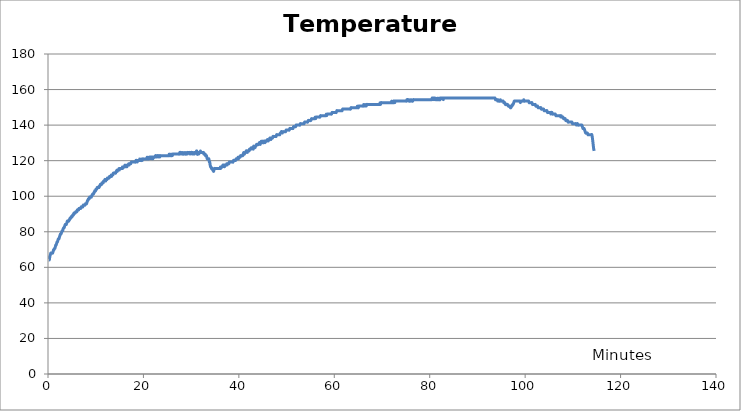
| Category | Temperature (Fahrenheit) |
|---|---|
| 0.18333333333333332 | 64.3 |
| 0.2833333333333333 | 64.3 |
| 0.38333333333333336 | 66.1 |
| 0.48333333333333334 | 67 |
| 0.5833333333333334 | 68 |
| 0.7 | 68 |
| 0.7833333333333333 | 68 |
| 0.8833333333333333 | 68 |
| 0.9666666666666667 | 68 |
| 1.0666666666666667 | 68.8 |
| 1.15 | 69.8 |
| 1.2333333333333334 | 69.8 |
| 1.3333333333333333 | 70.6 |
| 1.4333333333333333 | 70.6 |
| 1.5333333333333334 | 71.5 |
| 1.6166666666666667 | 72.5 |
| 1.7 | 72.5 |
| 1.8 | 73.3 |
| 1.9 | 74.3 |
| 1.9833333333333334 | 74.3 |
| 2.066666666666667 | 75.1 |
| 2.1666666666666665 | 76 |
| 2.283333333333333 | 76 |
| 2.4 | 77 |
| 2.5 | 77.8 |
| 2.6166666666666667 | 78.8 |
| 2.7333333333333334 | 78.8 |
| 2.8333333333333335 | 79.6 |
| 2.95 | 80.5 |
| 3.066666666666667 | 80.5 |
| 3.1666666666666665 | 81.5 |
| 3.283333333333333 | 82.3 |
| 3.4 | 82.3 |
| 3.5 | 83.3 |
| 3.6166666666666667 | 84.1 |
| 3.7333333333333334 | 84.1 |
| 3.8333333333333335 | 84.1 |
| 3.95 | 85 |
| 4.05 | 86 |
| 4.166666666666667 | 86 |
| 4.25 | 86 |
| 4.35 | 86 |
| 4.433333333333334 | 86.8 |
| 4.533333333333333 | 86.8 |
| 4.65 | 87.8 |
| 4.733333333333333 | 87.8 |
| 4.833333333333333 | 87.8 |
| 4.916666666666667 | 88.6 |
| 5.0 | 88.6 |
| 5.083333333333333 | 88.6 |
| 5.183333333333334 | 89.5 |
| 5.266666666666667 | 89.5 |
| 5.35 | 89.5 |
| 5.433333333333334 | 90.5 |
| 5.533333333333333 | 90.5 |
| 5.616666666666666 | 90.5 |
| 5.7 | 90.5 |
| 5.8 | 91.3 |
| 5.883333333333334 | 91.3 |
| 5.966666666666667 | 91.3 |
| 6.05 | 91.3 |
| 6.15 | 92.3 |
| 6.233333333333333 | 92.3 |
| 6.333333333333333 | 92.3 |
| 6.416666666666667 | 92.3 |
| 6.5 | 93.1 |
| 6.6 | 93.1 |
| 6.683333333333334 | 93.1 |
| 6.766666666666667 | 93.1 |
| 6.85 | 93.1 |
| 6.95 | 94 |
| 7.033333333333333 | 94 |
| 7.116666666666666 | 94 |
| 7.216666666666667 | 94 |
| 7.3 | 94 |
| 7.383333333333334 | 95 |
| 7.483333333333333 | 95 |
| 7.566666666666666 | 95 |
| 7.666666666666667 | 95 |
| 7.75 | 95 |
| 7.866666666666666 | 95.8 |
| 7.983333333333333 | 95.8 |
| 8.083333333333334 | 95.8 |
| 8.183333333333334 | 96.7 |
| 8.283333333333333 | 97.6 |
| 8.366666666666667 | 97.6 |
| 8.466666666666667 | 98.5 |
| 8.55 | 98.5 |
| 8.633333333333333 | 98.5 |
| 8.716666666666667 | 99.5 |
| 8.816666666666666 | 99.5 |
| 8.9 | 99.5 |
| 9.0 | 99.5 |
| 9.083333333333334 | 99.5 |
| 9.166666666666666 | 100.4 |
| 9.25 | 100.4 |
| 9.35 | 101.2 |
| 9.433333333333334 | 101.2 |
| 9.516666666666667 | 101.2 |
| 9.616666666666667 | 102.1 |
| 9.7 | 102.1 |
| 9.783333333333333 | 103 |
| 9.883333333333333 | 103 |
| 9.966666666666667 | 103 |
| 10.066666666666666 | 104 |
| 10.15 | 104 |
| 10.233333333333333 | 104 |
| 10.316666666666666 | 104.9 |
| 10.416666666666666 | 104.9 |
| 10.5 | 104.9 |
| 10.6 | 104.9 |
| 10.683333333333334 | 104.9 |
| 10.766666666666667 | 105.7 |
| 10.866666666666667 | 105.7 |
| 10.95 | 106.6 |
| 11.033333333333333 | 106.6 |
| 11.116666666666667 | 106.6 |
| 11.216666666666667 | 106.6 |
| 11.3 | 107.5 |
| 11.383333333333333 | 107.5 |
| 11.483333333333333 | 107.5 |
| 11.566666666666666 | 107.5 |
| 11.65 | 108.5 |
| 11.75 | 108.5 |
| 11.833333333333334 | 108.5 |
| 11.916666666666666 | 109.4 |
| 12.016666666666667 | 109.4 |
| 12.1 | 108.5 |
| 12.2 | 109.4 |
| 12.283333333333333 | 109.4 |
| 12.366666666666667 | 109.4 |
| 12.45 | 110.2 |
| 12.55 | 110.2 |
| 12.633333333333333 | 110.2 |
| 12.716666666666667 | 110.2 |
| 12.8 | 110.2 |
| 12.9 | 111.1 |
| 12.983333333333333 | 111.1 |
| 13.066666666666666 | 111.1 |
| 13.166666666666666 | 111.1 |
| 13.25 | 112 |
| 13.333333333333334 | 111.1 |
| 13.433333333333334 | 112 |
| 13.516666666666667 | 112 |
| 13.6 | 112 |
| 13.7 | 113 |
| 13.783333333333333 | 113 |
| 13.883333333333333 | 113 |
| 13.966666666666667 | 113 |
| 14.066666666666666 | 113 |
| 14.166666666666666 | 113 |
| 14.266666666666667 | 113.9 |
| 14.35 | 113.9 |
| 14.433333333333334 | 114.7 |
| 14.516666666666667 | 113.9 |
| 14.616666666666667 | 114.7 |
| 14.7 | 114.7 |
| 14.783333333333333 | 114.7 |
| 14.866666666666667 | 115.6 |
| 14.966666666666667 | 114.7 |
| 15.05 | 115.6 |
| 15.133333333333333 | 115.6 |
| 15.233333333333333 | 115.6 |
| 15.316666666666666 | 115.6 |
| 15.4 | 115.6 |
| 15.5 | 115.6 |
| 15.583333333333334 | 116.5 |
| 15.666666666666666 | 115.6 |
| 15.766666666666667 | 116.5 |
| 15.85 | 116.5 |
| 15.933333333333334 | 116.5 |
| 16.033333333333335 | 116.5 |
| 16.116666666666667 | 117.5 |
| 16.2 | 116.5 |
| 16.3 | 117.5 |
| 16.383333333333333 | 116.5 |
| 16.466666666666665 | 117.5 |
| 16.55 | 116.5 |
| 16.65 | 117.5 |
| 16.733333333333334 | 117.5 |
| 16.816666666666666 | 117.5 |
| 16.9 | 118.3 |
| 17.0 | 117.5 |
| 17.083333333333332 | 118.3 |
| 17.166666666666668 | 118.3 |
| 17.266666666666666 | 118.3 |
| 17.35 | 118.3 |
| 17.45 | 119.2 |
| 17.533333333333335 | 119.2 |
| 17.616666666666667 | 119.2 |
| 17.7 | 119.2 |
| 17.8 | 119.2 |
| 17.883333333333333 | 119.2 |
| 17.966666666666665 | 119.2 |
| 18.066666666666666 | 119.2 |
| 18.15 | 119.2 |
| 18.233333333333334 | 119.2 |
| 18.333333333333332 | 119.2 |
| 18.416666666666668 | 120.1 |
| 18.516666666666666 | 120.1 |
| 18.633333333333333 | 120.1 |
| 18.716666666666665 | 119.2 |
| 18.816666666666666 | 120.1 |
| 18.9 | 120.1 |
| 18.983333333333334 | 120.1 |
| 19.1 | 120.1 |
| 19.216666666666665 | 121 |
| 19.316666666666666 | 120.1 |
| 19.433333333333334 | 120.1 |
| 19.55 | 120.1 |
| 19.65 | 121 |
| 19.766666666666666 | 120.1 |
| 19.883333333333333 | 121 |
| 19.983333333333334 | 121 |
| 20.1 | 121 |
| 20.2 | 121 |
| 20.316666666666666 | 121 |
| 20.433333333333334 | 121 |
| 20.533333333333335 | 121 |
| 20.65 | 121 |
| 20.766666666666666 | 122 |
| 20.866666666666667 | 121 |
| 20.983333333333334 | 121 |
| 21.083333333333332 | 121 |
| 21.2 | 122 |
| 21.316666666666666 | 121 |
| 21.416666666666668 | 122 |
| 21.533333333333335 | 122 |
| 21.65 | 121 |
| 21.75 | 122 |
| 21.866666666666667 | 122 |
| 21.983333333333334 | 121 |
| 22.083333333333332 | 122 |
| 22.2 | 122 |
| 22.316666666666666 | 122 |
| 22.416666666666668 | 122 |
| 22.533333333333335 | 122.8 |
| 22.65 | 122.8 |
| 22.75 | 122 |
| 22.866666666666667 | 122.8 |
| 22.983333333333334 | 122.8 |
| 23.083333333333332 | 122 |
| 23.2 | 122.8 |
| 23.316666666666666 | 122.8 |
| 23.416666666666668 | 122 |
| 23.533333333333335 | 122.8 |
| 23.65 | 122.8 |
| 23.75 | 122.8 |
| 23.866666666666667 | 122.8 |
| 23.983333333333334 | 122.8 |
| 24.083333333333332 | 122.8 |
| 24.183333333333334 | 122.8 |
| 24.3 | 122.8 |
| 24.416666666666668 | 122.8 |
| 24.516666666666666 | 122.8 |
| 24.633333333333333 | 122.8 |
| 24.733333333333334 | 122.8 |
| 24.85 | 122.8 |
| 24.966666666666665 | 122.8 |
| 25.066666666666666 | 122.8 |
| 25.183333333333334 | 122.8 |
| 25.3 | 122.8 |
| 25.4 | 123.7 |
| 25.516666666666666 | 122.8 |
| 25.616666666666667 | 123.7 |
| 25.733333333333334 | 122.8 |
| 25.85 | 122.8 |
| 25.95 | 123.7 |
| 26.066666666666666 | 122.8 |
| 26.183333333333334 | 123.7 |
| 26.283333333333335 | 123.7 |
| 26.4 | 123.7 |
| 26.516666666666666 | 123.7 |
| 26.616666666666667 | 123.7 |
| 26.733333333333334 | 123.7 |
| 26.833333333333332 | 123.7 |
| 26.95 | 123.7 |
| 27.066666666666666 | 123.7 |
| 27.166666666666668 | 123.7 |
| 27.283333333333335 | 123.7 |
| 27.4 | 123.7 |
| 27.5 | 123.7 |
| 27.616666666666667 | 124.6 |
| 27.733333333333334 | 124.6 |
| 27.833333333333332 | 123.7 |
| 27.95 | 124.6 |
| 28.066666666666666 | 123.7 |
| 28.166666666666668 | 124.6 |
| 28.283333333333335 | 123.7 |
| 28.4 | 123.7 |
| 28.5 | 124.6 |
| 28.616666666666667 | 123.7 |
| 28.733333333333334 | 124.6 |
| 28.833333333333332 | 123.7 |
| 28.95 | 123.7 |
| 29.066666666666666 | 124.6 |
| 29.166666666666668 | 123.7 |
| 29.283333333333335 | 124.6 |
| 29.4 | 124.6 |
| 29.5 | 124.6 |
| 29.616666666666667 | 124.6 |
| 29.733333333333334 | 123.7 |
| 29.833333333333332 | 124.6 |
| 29.95 | 123.7 |
| 30.05 | 124.6 |
| 30.166666666666668 | 124.6 |
| 30.283333333333335 | 123.7 |
| 30.383333333333333 | 124.6 |
| 30.5 | 123.7 |
| 30.616666666666667 | 124.6 |
| 30.716666666666665 | 123.7 |
| 30.833333333333332 | 124.6 |
| 30.933333333333334 | 124.6 |
| 31.05 | 124.6 |
| 31.166666666666668 | 125.5 |
| 31.283333333333335 | 123.7 |
| 31.383333333333333 | 123.7 |
| 31.5 | 124.6 |
| 31.616666666666667 | 123.7 |
| 31.716666666666665 | 124.6 |
| 31.833333333333332 | 124.6 |
| 31.95 | 125.5 |
| 32.05 | 124.6 |
| 32.166666666666664 | 124.6 |
| 32.28333333333333 | 124.6 |
| 32.38333333333333 | 124.6 |
| 32.5 | 124.6 |
| 32.583333333333336 | 124.6 |
| 32.666666666666664 | 123.7 |
| 32.75 | 123.7 |
| 32.85 | 123.7 |
| 32.93333333333333 | 123.7 |
| 33.016666666666666 | 122.8 |
| 33.11666666666667 | 122.8 |
| 33.2 | 122.8 |
| 33.28333333333333 | 122 |
| 33.36666666666667 | 121 |
| 33.45 | 121 |
| 33.55 | 121 |
| 33.63333333333333 | 121 |
| 33.71666666666667 | 121 |
| 33.81666666666667 | 119.2 |
| 33.9 | 119.2 |
| 33.983333333333334 | 117.5 |
| 34.083333333333336 | 116.5 |
| 34.166666666666664 | 116.5 |
| 34.25 | 115.6 |
| 34.35 | 115.6 |
| 34.43333333333333 | 115.6 |
| 34.516666666666666 | 114.7 |
| 34.61666666666667 | 114.7 |
| 34.7 | 113.9 |
| 34.78333333333333 | 114.7 |
| 34.88333333333333 | 115.6 |
| 34.96666666666667 | 115.6 |
| 35.06666666666667 | 115.6 |
| 35.15 | 115.6 |
| 35.233333333333334 | 115.6 |
| 35.31666666666667 | 115.6 |
| 35.416666666666664 | 115.6 |
| 35.5 | 115.6 |
| 35.583333333333336 | 115.6 |
| 35.68333333333333 | 115.6 |
| 35.766666666666666 | 115.6 |
| 35.85 | 115.6 |
| 35.95 | 115.6 |
| 36.03333333333333 | 115.6 |
| 36.13333333333333 | 116.5 |
| 36.21666666666667 | 115.6 |
| 36.3 | 116.5 |
| 36.38333333333333 | 116.5 |
| 36.46666666666667 | 116.5 |
| 36.56666666666667 | 116.5 |
| 36.65 | 117.5 |
| 36.733333333333334 | 117.5 |
| 36.833333333333336 | 117.5 |
| 36.916666666666664 | 117.5 |
| 37.0 | 116.5 |
| 37.1 | 117.5 |
| 37.18333333333333 | 117.5 |
| 37.28333333333333 | 117.5 |
| 37.36666666666667 | 117.5 |
| 37.45 | 118.3 |
| 37.53333333333333 | 117.5 |
| 37.63333333333333 | 118.3 |
| 37.71666666666667 | 118.3 |
| 37.8 | 118.3 |
| 37.9 | 118.3 |
| 37.983333333333334 | 119.2 |
| 38.06666666666667 | 119.2 |
| 38.166666666666664 | 119.2 |
| 38.25 | 119.2 |
| 38.333333333333336 | 119.2 |
| 38.43333333333333 | 119.2 |
| 38.516666666666666 | 119.2 |
| 38.6 | 119.2 |
| 38.68333333333333 | 119.2 |
| 38.78333333333333 | 119.2 |
| 38.86666666666667 | 120.1 |
| 38.96666666666667 | 120.1 |
| 39.05 | 120.1 |
| 39.13333333333333 | 120.1 |
| 39.233333333333334 | 120.1 |
| 39.3 | 120.1 |
| 39.4 | 121 |
| 39.483333333333334 | 121 |
| 39.56666666666667 | 121 |
| 39.666666666666664 | 121 |
| 39.75 | 121 |
| 39.833333333333336 | 122 |
| 39.93333333333333 | 121 |
| 40.016666666666666 | 122 |
| 40.1 | 122 |
| 40.2 | 122 |
| 40.28333333333333 | 122 |
| 40.36666666666667 | 122.8 |
| 40.46666666666667 | 122.8 |
| 40.55 | 122.8 |
| 40.63333333333333 | 122.8 |
| 40.733333333333334 | 122.8 |
| 40.81666666666667 | 122.8 |
| 40.9 | 123.7 |
| 41.0 | 124.6 |
| 41.083333333333336 | 123.7 |
| 41.166666666666664 | 123.7 |
| 41.266666666666666 | 124.6 |
| 41.35 | 124.6 |
| 41.43333333333333 | 124.6 |
| 41.53333333333333 | 125.5 |
| 41.61666666666667 | 125.5 |
| 41.7 | 125.5 |
| 41.8 | 124.6 |
| 41.88333333333333 | 125.5 |
| 41.96666666666667 | 125.5 |
| 42.05 | 125.5 |
| 42.15 | 125.5 |
| 42.233333333333334 | 126.5 |
| 42.333333333333336 | 126.5 |
| 42.416666666666664 | 126.5 |
| 42.5 | 126.5 |
| 42.6 | 127.3 |
| 42.68333333333333 | 126.5 |
| 42.766666666666666 | 127.3 |
| 42.85 | 127.3 |
| 42.95 | 127.3 |
| 43.03333333333333 | 126.5 |
| 43.11666666666667 | 128.2 |
| 43.21666666666667 | 127.3 |
| 43.3 | 128.2 |
| 43.4 | 127.3 |
| 43.483333333333334 | 128.2 |
| 43.6 | 128.2 |
| 43.71666666666667 | 129.1 |
| 43.81666666666667 | 129.1 |
| 43.93333333333333 | 129.1 |
| 44.03333333333333 | 129.1 |
| 44.15 | 129.1 |
| 44.266666666666666 | 130.1 |
| 44.36666666666667 | 130.1 |
| 44.483333333333334 | 129.1 |
| 44.6 | 130.1 |
| 44.7 | 131 |
| 44.81666666666667 | 130.1 |
| 44.93333333333333 | 131 |
| 45.03333333333333 | 130.1 |
| 45.15 | 130.1 |
| 45.266666666666666 | 131 |
| 45.36666666666667 | 131 |
| 45.483333333333334 | 130.1 |
| 45.6 | 131 |
| 45.7 | 131 |
| 45.81666666666667 | 131 |
| 45.93333333333333 | 131.8 |
| 46.03333333333333 | 131.8 |
| 46.15 | 131 |
| 46.266666666666666 | 131.8 |
| 46.36666666666667 | 131.8 |
| 46.483333333333334 | 132.7 |
| 46.583333333333336 | 132.7 |
| 46.7 | 131.8 |
| 46.81666666666667 | 132.7 |
| 46.916666666666664 | 132.7 |
| 47.03333333333333 | 132.7 |
| 47.15 | 133.6 |
| 47.25 | 133.6 |
| 47.36666666666667 | 133.6 |
| 47.46666666666667 | 133.6 |
| 47.583333333333336 | 133.6 |
| 47.7 | 133.6 |
| 47.8 | 133.6 |
| 47.916666666666664 | 134.6 |
| 48.03333333333333 | 134.6 |
| 48.13333333333333 | 134.6 |
| 48.233333333333334 | 134.6 |
| 48.35 | 134.6 |
| 48.46666666666667 | 134.6 |
| 48.56666666666667 | 134.6 |
| 48.68333333333333 | 135.5 |
| 48.8 | 135.5 |
| 48.9 | 136.3 |
| 49.016666666666666 | 136.3 |
| 49.13333333333333 | 135.5 |
| 49.233333333333334 | 136.3 |
| 49.35 | 136.3 |
| 49.46666666666667 | 136.3 |
| 49.56666666666667 | 136.3 |
| 49.68333333333333 | 136.3 |
| 49.8 | 136.3 |
| 49.9 | 137.2 |
| 50.016666666666666 | 137.2 |
| 50.13333333333333 | 137.2 |
| 50.233333333333334 | 137.2 |
| 50.35 | 137.2 |
| 50.46666666666667 | 137.2 |
| 50.56666666666667 | 137.2 |
| 50.68333333333333 | 138.1 |
| 50.78333333333333 | 138.1 |
| 50.9 | 138.1 |
| 51.016666666666666 | 138.1 |
| 51.11666666666667 | 138.1 |
| 51.233333333333334 | 138.1 |
| 51.35 | 138.1 |
| 51.45 | 139.1 |
| 51.56666666666667 | 139.1 |
| 51.666666666666664 | 139.1 |
| 51.78333333333333 | 139.1 |
| 51.9 | 139.1 |
| 52.0 | 140 |
| 52.11666666666667 | 140 |
| 52.21666666666667 | 140 |
| 52.333333333333336 | 140 |
| 52.45 | 140 |
| 52.55 | 140 |
| 52.666666666666664 | 140 |
| 52.78333333333333 | 140 |
| 52.88333333333333 | 140.8 |
| 53.0 | 140.8 |
| 53.11666666666667 | 140.8 |
| 53.21666666666667 | 140.8 |
| 53.333333333333336 | 140.8 |
| 53.45 | 140.8 |
| 53.55 | 140.8 |
| 53.666666666666664 | 140.8 |
| 53.78333333333333 | 141.7 |
| 53.88333333333333 | 141.7 |
| 54.0 | 141.7 |
| 54.11666666666667 | 141.7 |
| 54.21666666666667 | 141.7 |
| 54.333333333333336 | 141.7 |
| 54.43333333333333 | 141.7 |
| 54.55 | 142.6 |
| 54.666666666666664 | 142.6 |
| 54.766666666666666 | 142.6 |
| 54.88333333333333 | 142.6 |
| 54.983333333333334 | 142.6 |
| 55.1 | 142.6 |
| 55.21666666666667 | 143.6 |
| 55.31666666666667 | 143.6 |
| 55.43333333333333 | 143.6 |
| 55.55 | 143.6 |
| 55.65 | 143.6 |
| 55.766666666666666 | 143.6 |
| 55.86666666666667 | 143.6 |
| 55.983333333333334 | 144.5 |
| 56.1 | 143.6 |
| 56.2 | 144.5 |
| 56.31666666666667 | 144.5 |
| 56.43333333333333 | 144.5 |
| 56.53333333333333 | 144.5 |
| 56.65 | 144.5 |
| 56.766666666666666 | 144.5 |
| 56.86666666666667 | 144.5 |
| 56.983333333333334 | 144.5 |
| 57.1 | 145.3 |
| 57.2 | 145.3 |
| 57.31666666666667 | 145.3 |
| 57.43333333333333 | 145.3 |
| 57.53333333333333 | 145.3 |
| 57.65 | 145.3 |
| 57.766666666666666 | 145.3 |
| 57.86666666666667 | 145.3 |
| 57.983333333333334 | 145.3 |
| 58.083333333333336 | 145.3 |
| 58.2 | 145.3 |
| 58.31666666666667 | 146.2 |
| 58.416666666666664 | 145.3 |
| 58.53333333333333 | 146.2 |
| 58.63333333333333 | 146.2 |
| 58.75 | 146.2 |
| 58.86666666666667 | 146.2 |
| 58.96666666666667 | 146.2 |
| 59.083333333333336 | 146.2 |
| 59.18333333333333 | 146.2 |
| 59.3 | 146.2 |
| 59.416666666666664 | 146.2 |
| 59.516666666666666 | 147.1 |
| 59.63333333333333 | 147.1 |
| 59.75 | 147.1 |
| 59.85 | 147.1 |
| 59.96666666666667 | 147.1 |
| 60.083333333333336 | 147.1 |
| 60.18333333333333 | 147.1 |
| 60.3 | 147.1 |
| 60.416666666666664 | 147.1 |
| 60.516666666666666 | 148.1 |
| 60.63333333333333 | 148.1 |
| 60.75 | 148.1 |
| 60.85 | 148.1 |
| 60.96666666666667 | 148.1 |
| 61.083333333333336 | 148.1 |
| 61.18333333333333 | 148.1 |
| 61.3 | 148.1 |
| 61.4 | 148.1 |
| 61.516666666666666 | 148.1 |
| 61.63333333333333 | 148.1 |
| 61.733333333333334 | 149 |
| 61.85 | 149 |
| 61.95 | 149 |
| 62.06666666666667 | 149 |
| 62.18333333333333 | 149 |
| 62.28333333333333 | 149 |
| 62.4 | 149 |
| 62.5 | 149 |
| 62.61666666666667 | 149 |
| 62.733333333333334 | 149 |
| 62.833333333333336 | 149 |
| 62.95 | 149 |
| 63.06666666666667 | 149 |
| 63.166666666666664 | 149 |
| 63.28333333333333 | 149 |
| 63.4 | 149 |
| 63.5 | 149.8 |
| 63.61666666666667 | 149.8 |
| 63.733333333333334 | 149.8 |
| 63.833333333333336 | 149.8 |
| 63.95 | 149.8 |
| 64.06666666666666 | 149.8 |
| 64.16666666666667 | 149.8 |
| 64.28333333333333 | 149.8 |
| 64.38333333333334 | 149.8 |
| 64.5 | 149.8 |
| 64.61666666666666 | 149.8 |
| 64.71666666666667 | 149.8 |
| 64.83333333333333 | 150.7 |
| 64.95 | 149.8 |
| 65.05 | 149.8 |
| 65.16666666666667 | 150.7 |
| 65.26666666666667 | 150.7 |
| 65.38333333333334 | 150.7 |
| 65.48333333333333 | 150.7 |
| 65.6 | 150.7 |
| 65.71666666666667 | 150.7 |
| 65.81666666666666 | 150.7 |
| 65.93333333333334 | 150.7 |
| 66.03333333333333 | 150.7 |
| 66.15 | 151.6 |
| 66.26666666666667 | 150.7 |
| 66.38333333333334 | 151.6 |
| 66.48333333333333 | 150.7 |
| 66.6 | 151.6 |
| 66.71666666666667 | 150.7 |
| 66.81666666666666 | 151.6 |
| 66.93333333333334 | 151.6 |
| 67.05 | 151.6 |
| 67.16666666666667 | 151.6 |
| 67.26666666666667 | 151.6 |
| 67.36666666666666 | 151.6 |
| 67.48333333333333 | 151.6 |
| 67.6 | 151.6 |
| 67.7 | 151.6 |
| 67.81666666666666 | 151.6 |
| 67.91666666666667 | 151.6 |
| 68.03333333333333 | 151.6 |
| 68.15 | 151.6 |
| 68.25 | 151.6 |
| 68.36666666666666 | 151.6 |
| 68.48333333333333 | 151.6 |
| 68.58333333333333 | 151.6 |
| 68.7 | 151.6 |
| 68.8 | 151.6 |
| 68.91666666666667 | 151.6 |
| 69.03333333333333 | 151.6 |
| 69.13333333333334 | 151.6 |
| 69.25 | 151.6 |
| 69.36666666666666 | 151.6 |
| 69.46666666666667 | 151.6 |
| 69.58333333333333 | 152.6 |
| 69.7 | 151.6 |
| 69.8 | 152.6 |
| 69.91666666666667 | 152.6 |
| 70.03333333333333 | 152.6 |
| 70.13333333333334 | 152.6 |
| 70.25 | 152.6 |
| 70.36666666666666 | 152.6 |
| 70.46666666666667 | 152.6 |
| 70.58333333333333 | 152.6 |
| 70.68333333333334 | 152.6 |
| 70.8 | 152.6 |
| 70.91666666666667 | 152.6 |
| 71.01666666666667 | 152.6 |
| 71.13333333333334 | 152.6 |
| 71.23333333333333 | 152.6 |
| 71.35 | 152.6 |
| 71.46666666666667 | 152.6 |
| 71.56666666666666 | 152.6 |
| 71.68333333333334 | 152.6 |
| 71.78333333333333 | 152.6 |
| 71.9 | 152.6 |
| 72.01666666666667 | 153.5 |
| 72.11666666666666 | 152.6 |
| 72.23333333333333 | 152.6 |
| 72.35 | 152.6 |
| 72.45 | 153.5 |
| 72.56666666666666 | 153.5 |
| 72.68333333333334 | 152.6 |
| 72.78333333333333 | 153.5 |
| 72.9 | 153.5 |
| 73.01666666666667 | 153.5 |
| 73.11666666666666 | 153.5 |
| 73.23333333333333 | 153.5 |
| 73.35 | 153.5 |
| 73.45 | 153.5 |
| 73.56666666666666 | 153.5 |
| 73.66666666666667 | 153.5 |
| 73.78333333333333 | 153.5 |
| 73.9 | 153.5 |
| 74.0 | 153.5 |
| 74.11666666666666 | 153.5 |
| 74.21666666666667 | 153.5 |
| 74.33333333333333 | 153.5 |
| 74.45 | 153.5 |
| 74.55 | 153.5 |
| 74.66666666666667 | 153.5 |
| 74.76666666666667 | 153.5 |
| 74.88333333333334 | 153.5 |
| 75.0 | 153.5 |
| 75.1 | 153.5 |
| 75.21666666666667 | 154.3 |
| 75.33333333333333 | 154.3 |
| 75.43333333333334 | 154.3 |
| 75.55 | 153.5 |
| 75.66666666666667 | 154.3 |
| 75.76666666666667 | 153.5 |
| 75.88333333333334 | 153.5 |
| 76.0 | 154.3 |
| 76.1 | 153.5 |
| 76.21666666666667 | 154.3 |
| 76.33333333333333 | 153.5 |
| 76.43333333333334 | 153.5 |
| 76.55 | 154.3 |
| 76.65 | 154.3 |
| 76.76666666666667 | 154.3 |
| 76.88333333333334 | 154.3 |
| 76.98333333333333 | 154.3 |
| 77.1 | 154.3 |
| 77.2 | 154.3 |
| 77.31666666666666 | 154.3 |
| 77.43333333333334 | 154.3 |
| 77.53333333333333 | 154.3 |
| 77.65 | 154.3 |
| 77.75 | 154.3 |
| 77.86666666666666 | 154.3 |
| 77.98333333333333 | 154.3 |
| 78.08333333333333 | 154.3 |
| 78.2 | 154.3 |
| 78.31666666666666 | 154.3 |
| 78.41666666666667 | 154.3 |
| 78.53333333333333 | 154.3 |
| 78.65 | 154.3 |
| 78.75 | 154.3 |
| 78.86666666666666 | 154.3 |
| 78.98333333333333 | 154.3 |
| 79.08333333333333 | 154.3 |
| 79.2 | 154.3 |
| 79.3 | 154.3 |
| 79.41666666666667 | 154.3 |
| 79.53333333333333 | 154.3 |
| 79.63333333333334 | 154.3 |
| 79.75 | 154.3 |
| 79.86666666666666 | 154.3 |
| 79.96666666666667 | 154.3 |
| 80.08333333333333 | 154.3 |
| 80.18333333333334 | 154.3 |
| 80.3 | 154.3 |
| 80.41666666666667 | 154.3 |
| 80.51666666666667 | 155.2 |
| 80.63333333333334 | 155.2 |
| 80.73333333333333 | 154.3 |
| 80.85 | 155.2 |
| 80.96666666666667 | 155.2 |
| 81.06666666666666 | 154.3 |
| 81.18333333333334 | 155.2 |
| 81.3 | 154.3 |
| 81.4 | 154.3 |
| 81.51666666666667 | 154.3 |
| 81.63333333333334 | 155.2 |
| 81.73333333333333 | 154.3 |
| 81.85 | 154.3 |
| 81.96666666666667 | 155.2 |
| 82.06666666666666 | 154.3 |
| 82.18333333333334 | 154.3 |
| 82.28333333333333 | 155.2 |
| 82.4 | 155.2 |
| 82.51666666666667 | 155.2 |
| 82.63333333333334 | 155.2 |
| 82.73333333333333 | 155.2 |
| 82.85 | 154.3 |
| 82.95 | 155.2 |
| 83.06666666666666 | 155.2 |
| 83.18333333333334 | 155.2 |
| 83.28333333333333 | 155.2 |
| 83.4 | 155.2 |
| 83.51666666666667 | 155.2 |
| 83.61666666666666 | 155.2 |
| 83.73333333333333 | 155.2 |
| 83.83333333333333 | 155.2 |
| 83.95 | 155.2 |
| 84.06666666666666 | 155.2 |
| 84.16666666666667 | 155.2 |
| 84.28333333333333 | 155.2 |
| 84.4 | 155.2 |
| 84.51666666666667 | 155.2 |
| 84.61666666666666 | 155.2 |
| 84.73333333333333 | 155.2 |
| 84.85 | 155.2 |
| 84.95 | 155.2 |
| 85.06666666666666 | 155.2 |
| 85.18333333333334 | 155.2 |
| 85.28333333333333 | 155.2 |
| 85.4 | 155.2 |
| 85.5 | 155.2 |
| 85.61666666666666 | 155.2 |
| 85.73333333333333 | 155.2 |
| 85.83333333333333 | 155.2 |
| 85.95 | 155.2 |
| 86.05 | 155.2 |
| 86.16666666666667 | 155.2 |
| 86.26666666666667 | 155.2 |
| 86.38333333333334 | 155.2 |
| 86.5 | 155.2 |
| 86.6 | 155.2 |
| 86.71666666666667 | 155.2 |
| 86.81666666666666 | 155.2 |
| 86.93333333333334 | 155.2 |
| 87.05 | 155.2 |
| 87.15 | 155.2 |
| 87.26666666666667 | 155.2 |
| 87.38333333333334 | 155.2 |
| 87.48333333333333 | 155.2 |
| 87.6 | 155.2 |
| 87.71666666666667 | 155.2 |
| 87.81666666666666 | 155.2 |
| 87.93333333333334 | 155.2 |
| 88.05 | 155.2 |
| 88.15 | 155.2 |
| 88.26666666666667 | 155.2 |
| 88.36666666666666 | 155.2 |
| 88.48333333333333 | 155.2 |
| 88.6 | 155.2 |
| 88.7 | 155.2 |
| 88.81666666666666 | 155.2 |
| 88.91666666666667 | 155.2 |
| 89.03333333333333 | 155.2 |
| 89.15 | 155.2 |
| 89.25 | 155.2 |
| 89.36666666666666 | 155.2 |
| 89.46666666666667 | 155.2 |
| 89.58333333333333 | 155.2 |
| 89.7 | 155.2 |
| 89.8 | 155.2 |
| 89.91666666666667 | 155.2 |
| 90.03333333333333 | 155.2 |
| 90.13333333333334 | 155.2 |
| 90.25 | 155.2 |
| 90.36666666666666 | 155.2 |
| 90.46666666666667 | 155.2 |
| 90.58333333333333 | 155.2 |
| 90.7 | 155.2 |
| 90.8 | 155.2 |
| 90.91666666666667 | 155.2 |
| 91.03333333333333 | 155.2 |
| 91.13333333333334 | 155.2 |
| 91.25 | 155.2 |
| 91.35 | 155.2 |
| 91.46666666666667 | 155.2 |
| 91.58333333333333 | 155.2 |
| 91.68333333333334 | 155.2 |
| 91.8 | 155.2 |
| 91.9 | 155.2 |
| 92.01666666666667 | 155.2 |
| 92.13333333333334 | 155.2 |
| 92.23333333333333 | 155.2 |
| 92.35 | 155.2 |
| 92.45 | 155.2 |
| 92.56666666666666 | 155.2 |
| 92.68333333333334 | 155.2 |
| 92.78333333333333 | 155.2 |
| 92.9 | 155.2 |
| 93.01666666666667 | 155.2 |
| 93.11666666666666 | 155.2 |
| 93.23333333333333 | 155.2 |
| 93.35 | 155.2 |
| 93.45 | 155.2 |
| 93.56666666666666 | 155.2 |
| 93.68333333333334 | 155.2 |
| 93.78333333333333 | 154.3 |
| 93.9 | 154.3 |
| 94.0 | 154.3 |
| 94.11666666666666 | 154.3 |
| 94.23333333333333 | 153.5 |
| 94.35 | 154.3 |
| 94.46666666666667 | 153.5 |
| 94.58333333333333 | 153.5 |
| 94.7 | 153.5 |
| 94.81666666666666 | 154.3 |
| 94.93333333333334 | 153.5 |
| 95.05 | 153.5 |
| 95.16666666666667 | 153.5 |
| 95.28333333333333 | 153.5 |
| 95.4 | 153.5 |
| 95.51666666666667 | 152.6 |
| 95.63333333333334 | 152.6 |
| 95.75 | 152.6 |
| 95.86666666666666 | 151.6 |
| 95.98333333333333 | 151.6 |
| 96.1 | 151.6 |
| 96.21666666666667 | 151.6 |
| 96.33333333333333 | 151.6 |
| 96.45 | 150.7 |
| 96.56666666666666 | 150.7 |
| 96.68333333333334 | 150.7 |
| 96.78333333333333 | 150.7 |
| 96.9 | 149.8 |
| 97.01666666666667 | 149.8 |
| 97.13333333333334 | 150.7 |
| 97.25 | 150.7 |
| 97.36666666666666 | 151.6 |
| 97.48333333333333 | 151.6 |
| 97.6 | 152.6 |
| 97.71666666666667 | 153.5 |
| 97.83333333333333 | 153.5 |
| 97.95 | 153.5 |
| 98.06666666666666 | 153.5 |
| 98.18333333333334 | 153.5 |
| 98.3 | 153.5 |
| 98.41666666666667 | 153.5 |
| 98.53333333333333 | 153.5 |
| 98.65 | 153.5 |
| 98.76666666666667 | 153.5 |
| 98.88333333333334 | 153.5 |
| 99.0 | 152.6 |
| 99.11666666666666 | 153.5 |
| 99.23333333333333 | 153.5 |
| 99.35 | 153.5 |
| 99.46666666666667 | 153.5 |
| 99.58333333333333 | 153.5 |
| 99.7 | 154.3 |
| 99.81666666666666 | 153.5 |
| 99.93333333333334 | 153.5 |
| 100.03333333333333 | 153.5 |
| 100.15 | 153.5 |
| 100.26666666666667 | 153.5 |
| 100.38333333333334 | 153.5 |
| 100.5 | 153.5 |
| 100.61666666666666 | 153.5 |
| 100.73333333333333 | 153.5 |
| 100.85 | 152.6 |
| 100.96666666666667 | 152.6 |
| 101.08333333333333 | 152.6 |
| 101.2 | 152.6 |
| 101.31666666666666 | 152.6 |
| 101.43333333333334 | 152.6 |
| 101.55 | 151.6 |
| 101.66666666666667 | 151.6 |
| 101.78333333333333 | 151.6 |
| 101.9 | 151.6 |
| 102.01666666666667 | 151.6 |
| 102.13333333333334 | 151.6 |
| 102.25 | 150.7 |
| 102.36666666666666 | 150.7 |
| 102.48333333333333 | 150.7 |
| 102.6 | 150.7 |
| 102.71666666666667 | 149.8 |
| 102.83333333333333 | 149.8 |
| 102.95 | 149.8 |
| 103.06666666666666 | 149.8 |
| 103.18333333333334 | 149.8 |
| 103.3 | 149.8 |
| 103.4 | 149 |
| 103.53333333333333 | 149 |
| 103.63333333333334 | 149 |
| 103.75 | 149 |
| 103.86666666666666 | 149 |
| 103.98333333333333 | 148.1 |
| 104.1 | 148.1 |
| 104.21666666666667 | 148.1 |
| 104.33333333333333 | 148.1 |
| 104.45 | 148.1 |
| 104.56666666666666 | 148.1 |
| 104.68333333333334 | 147.1 |
| 104.8 | 147.1 |
| 104.91666666666667 | 147.1 |
| 105.03333333333333 | 147.1 |
| 105.15 | 147.1 |
| 105.26666666666667 | 147.1 |
| 105.38333333333334 | 146.2 |
| 105.5 | 147.1 |
| 105.61666666666666 | 147.1 |
| 105.73333333333333 | 146.2 |
| 105.85 | 146.2 |
| 105.96666666666667 | 146.2 |
| 106.08333333333333 | 146.2 |
| 106.2 | 146.2 |
| 106.31666666666666 | 146.2 |
| 106.43333333333334 | 145.3 |
| 106.55 | 145.3 |
| 106.66666666666667 | 145.3 |
| 106.78333333333333 | 145.3 |
| 106.9 | 145.3 |
| 107.01666666666667 | 145.3 |
| 107.13333333333334 | 145.3 |
| 107.25 | 145.3 |
| 107.35 | 145.3 |
| 107.46666666666667 | 144.5 |
| 107.58333333333333 | 145.3 |
| 107.7 | 144.5 |
| 107.81666666666666 | 144.5 |
| 107.93333333333334 | 144.5 |
| 108.05 | 143.6 |
| 108.16666666666667 | 143.6 |
| 108.28333333333333 | 143.6 |
| 108.4 | 143.6 |
| 108.51666666666667 | 142.6 |
| 108.63333333333334 | 142.6 |
| 108.75 | 142.6 |
| 108.86666666666666 | 142.6 |
| 108.98333333333333 | 141.7 |
| 109.1 | 141.7 |
| 109.21666666666667 | 141.7 |
| 109.33333333333333 | 141.7 |
| 109.45 | 141.7 |
| 109.56666666666666 | 141.7 |
| 109.68333333333334 | 141.7 |
| 109.8 | 141.7 |
| 109.91666666666667 | 140.8 |
| 110.03333333333333 | 140.8 |
| 110.15 | 140.8 |
| 110.26666666666667 | 140.8 |
| 110.38333333333334 | 140.8 |
| 110.5 | 140.8 |
| 110.61666666666666 | 140.8 |
| 110.73333333333333 | 140 |
| 110.85 | 140.8 |
| 110.96666666666667 | 140.8 |
| 111.08333333333333 | 140 |
| 111.2 | 140 |
| 111.31666666666666 | 140 |
| 111.43333333333334 | 140 |
| 111.53333333333333 | 140 |
| 111.65 | 140 |
| 111.76666666666667 | 140 |
| 111.88333333333334 | 140 |
| 112.0 | 139.1 |
| 112.11666666666666 | 138.1 |
| 112.23333333333333 | 138.1 |
| 112.35 | 138.1 |
| 112.46666666666667 | 137.2 |
| 112.58333333333333 | 136.3 |
| 112.7 | 135.5 |
| 112.81666666666666 | 135.5 |
| 112.93333333333334 | 135.5 |
| 113.05 | 135.5 |
| 113.16666666666667 | 134.6 |
| 113.28333333333333 | 134.6 |
| 113.4 | 134.6 |
| 113.51666666666667 | 134.6 |
| 113.63333333333334 | 134.6 |
| 113.75 | 134.6 |
| 113.86666666666666 | 134.6 |
| 113.98333333333333 | 134.6 |
| 114.1 | 132.7 |
| 114.21666666666667 | 130.1 |
| 114.33333333333333 | 127.3 |
| 114.45 | 125.5 |